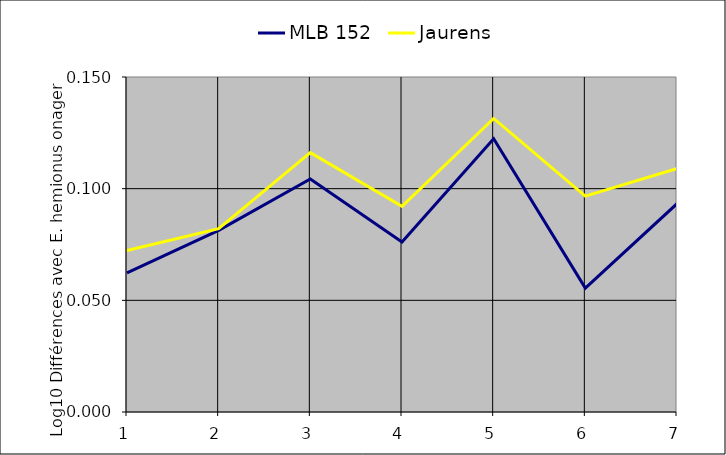
| Category | MLB 152  | Jaurens |
|---|---|---|
| 1.0 | 0.062 | 0.072 |
| 2.0 | 0.081 | 0.082 |
| 3.0 | 0.104 | 0.116 |
| 4.0 | 0.076 | 0.092 |
| 5.0 | 0.122 | 0.131 |
| 6.0 | 0.055 | 0.097 |
| 7.0 | 0.093 | 0.109 |